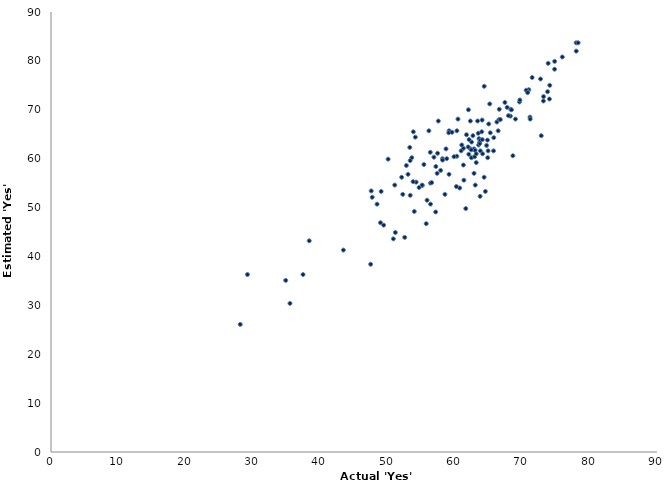
| Category | Actual 'Yes' Vote |
|---|---|
| 68.2610745405752 | 70.1 |
| 62.82767049894101 | 62 |
| 67.74076614883504 | 70.5 |
| 51.14073115861672 | 44.9 |
| 63.73012142769656 | 52.3 |
| 50.84361881896663 | 43.6 |
| 62.988939988684066 | 61.7 |
| 65.16162690926504 | 71.2 |
| 68.22920973409953 | 68.7 |
| 61.59928011696089 | 49.8 |
| 63.01147805578603 | 54.6 |
| 58.775935711932 | 60 |
| 28.11116245126307 | 26.1 |
| 62.29483687440144 | 62 |
| 71.14184041360124 | 68.5 |
| 61.24989561771574 | 62.1 |
| 60.699886210768696 | 54 |
| 68.59651685358246 | 60.6 |
| 65.00896386988279 | 67.1 |
| 73.84040625948475 | 79.5 |
| 48.934811239962 | 46.9 |
| 57.34713037267385 | 57 |
| 53.577271563785736 | 60.2 |
| 38.35346732697622 | 43.2 |
| 70.9597447468351 | 74.1 |
| 62.43690230630419 | 60.2 |
| 54.66331980094181 | 54.1 |
| 68.98211707770957 | 68.1 |
| 43.42355993840078 | 41.3 |
| 65.72701260812167 | 61.6 |
| 56.34670143778964 | 55 |
| 69.57461777552675 | 71.6 |
| 62.282586350073984 | 67.7 |
| 55.38018015268185 | 58.8 |
| 58.14205548427907 | 60 |
| 59.1240450795095 | 65.7 |
| 74.02734235649422 | 72.2 |
| 56.53632876206446 | 55.1 |
| 66.41245367758339 | 65.7 |
| 70.81588984942961 | 73.8 |
| 63.45498108301544 | 65.2 |
| 56.11798164866424 | 65.7 |
| 69.63533126906422 | 72 |
| 63.154494871079294 | 59.2 |
| 61.7087374688345 | 64.9 |
| 62.41178231161179 | 61.8 |
| 65.75881650586038 | 64.3 |
| 54.22759138952476 | 55.2 |
| 70.57262126808646 | 74 |
| 63.50740994198918 | 62.8 |
| 68.38932987024764 | 70 |
| 55.85453840964382 | 51.5 |
| 60.26694009688215 | 60.5 |
| 64.82243347445316 | 63.8 |
| 29.178929768812928 | 36.3 |
| 67.93754501427424 | 68.8 |
| 66.5785973060618 | 70.1 |
| 60.4418535943227 | 68.1 |
| 58.661906785637214 | 62 |
| 64.85581263694876 | 60.2 |
| 72.70422495220123 | 76.3 |
| 49.03341532393072 | 53.3 |
| 74.79866550326821 | 79.9 |
| 49.40595647573494 | 46.4 |
| 64.50939504980238 | 53.3 |
| 71.4564681777719 | 76.6 |
| 53.956040553575576 | 49.2 |
| 61.950731132751805 | 62.4 |
| 61.008877690791195 | 62.8 |
| 74.79020017164771 | 78.3 |
| 63.64782033723144 | 63.3 |
| 56.36807732293875 | 50.7 |
| 48.42588617726276 | 50.7 |
| 53.33835810744352 | 59.6 |
| 57.1609121122726 | 58.4 |
| 52.77979387040673 | 58.6 |
| 54.10891975311527 | 64.4 |
| 63.67632675959027 | 63.1 |
| 59.07483470267393 | 65.3 |
| 70.78650366617522 | 73.5 |
| 55.72672538964794 | 46.7 |
| 63.56501556600245 | 64.1 |
| 71.16868727715868 | 68.1 |
| 73.74994818969132 | 73.7 |
| 66.22240026515047 | 67.5 |
| 53.02704137050248 | 56.8 |
| 62.46429751782226 | 63.4 |
| 63.35721292311338 | 67.7 |
| 52.079471273736296 | 56.2 |
| 55.13099438409101 | 54.5 |
| 59.84906767953292 | 60.4 |
| 53.777036012506194 | 55.3 |
| 61.25114897191203 | 58.7 |
| 47.70579956856635 | 52.1 |
| 66.5379693725929 | 68 |
| 62.08874843025988 | 63.9 |
| 62.91586119122081 | 60.4 |
| 60.201462151521305 | 54.3 |
| 52.53216149155703 | 43.9 |
| 50.06761252910704 | 59.9 |
| 72.81186923309325 | 64.7 |
| 59.55331123154082 | 65.4 |
| 34.857738085887014 | 35.1 |
| 64.69374289772584 | 62.7 |
| 63.9723072454949 | 65.5 |
| 77.9946598075339 | 83.7 |
| 78.00743505268623 | 82 |
| 62.82686971779425 | 57 |
| 57.1276858258927 | 49.1 |
| 63.75676236498786 | 63.8 |
| 66.73710794890299 | 68 |
| 62.04451258261564 | 60.9 |
| 57.867865304825 | 57.6 |
| 53.35333634800731 | 52.5 |
| 64.34089942817735 | 74.8 |
| 73.1284230204354 | 71.8 |
| 64.32572023046045 | 56.2 |
| 56.871416176195844 | 60.3 |
| 58.154904749745235 | 59.7 |
| 52.244269942638866 | 52.7 |
| 47.472849554604444 | 38.4 |
| 53.81430551071902 | 65.5 |
| 64.0563438031144 | 63.9 |
| 67.40764696845804 | 71.5 |
| 60.91241505124027 | 61.6 |
| 56.331316737484826 | 61.3 |
| 55.120569596022044 | 54.6 |
| 58.50252019967463 | 52.7 |
| 64.02666379338196 | 67.9 |
| 51.05342196554112 | 54.6 |
| 60.283089855459394 | 65.7 |
| 73.15196147641336 | 72.7 |
| 47.558786679316746 | 53.4 |
| 57.52393713955066 | 67.7 |
| 65.24018019819452 | 65.3 |
| 57.41082006400964 | 61.1 |
| 63.77234936138964 | 61.6 |
| 62.661913636493225 | 64.7 |
| 78.2889718249696 | 83.7 |
| 64.91808286827757 | 61.6 |
| 64.10213349941381 | 61 |
| 63.15232149239898 | 61 |
| 74.07461798203938 | 75 |
| 35.49176334387438 | 30.4 |
| 75.93767253058772 | 80.8 |
| 37.42946190560736 | 36.3 |
| 53.282127463644606 | 62.3 |
| 61.32048071603333 | 55.6 |
| 61.99408097344083 | 70 |
| 59.11348515473146 | 56.8 |